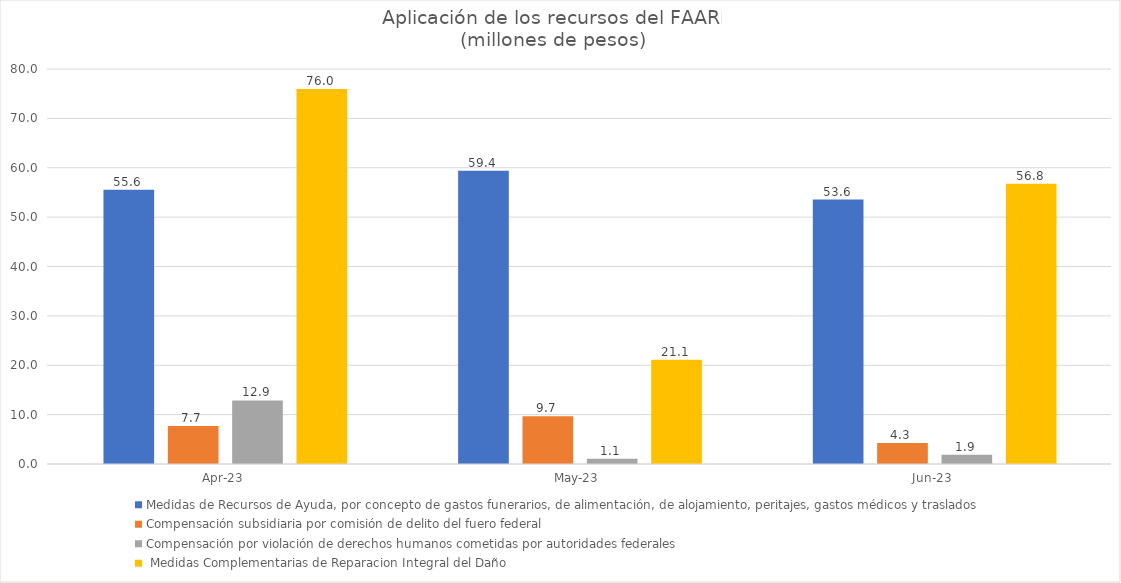
| Category | Medidas de Recursos de Ayuda, por concepto de gastos funerarios, de alimentación, de alojamiento, peritajes, gastos médicos y traslados | Compensación subsidiaria por comisión de delito del fuero federal | Compensación por violación de derechos humanos cometidas por autoridades federales |  Medidas Complementarias de Reparacion Integral del Daño |
|---|---|---|---|---|
| 2023-04-01 | 55.562 | 7.672 | 12.876 | 75.972 |
| 2023-05-01 | 59.409 | 9.654 | 1.081 | 21.098 |
| 2023-06-01 | 53.559 | 4.273 | 1.895 | 56.78 |